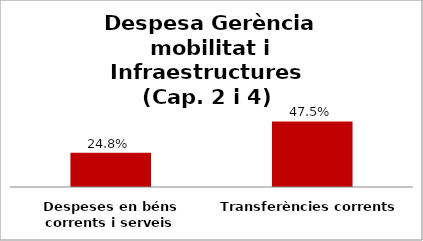
| Category | Series 0 |
|---|---|
| Despeses en béns corrents i serveis | 0.248 |
| Transferències corrents | 0.475 |